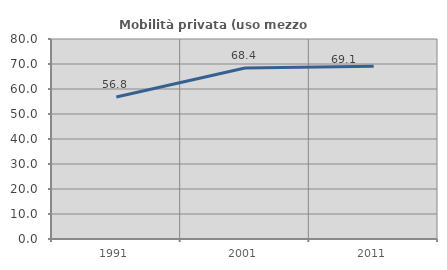
| Category | Mobilità privata (uso mezzo privato) |
|---|---|
| 1991.0 | 56.825 |
| 2001.0 | 68.432 |
| 2011.0 | 69.148 |